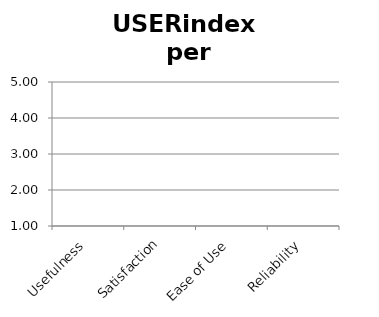
| Category | Series 0 |
|---|---|
| Usefulness | 0 |
| Satisfaction | 0 |
| Ease of Use | 0 |
| Reliability | 0 |